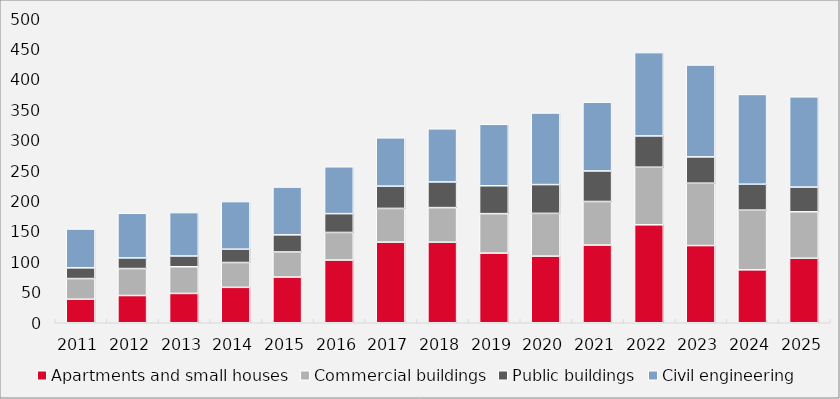
| Category | Apartments and small houses | Commercial buildings | Public buildings | Civil engineering |
|---|---|---|---|---|
| 2011.0 | 38.745 | 33.919 | 17.687 | 63.85 |
| 2012.0 | 44.777 | 44.354 | 17.47 | 73.444 |
| 2013.0 | 48.213 | 43.908 | 17.683 | 71.376 |
| 2014.0 | 58.248 | 40.844 | 21.916 | 78.301 |
| 2015.0 | 75.126 | 41.314 | 28.17 | 78.589 |
| 2016.0 | 103.136 | 45.359 | 30.965 | 77.108 |
| 2017.0 | 132.657 | 55.407 | 36.654 | 79.478 |
| 2018.0 | 132.554 | 56.824 | 42.217 | 87.371 |
| 2019.0 | 114.522 | 64.913 | 45.879 | 101.087 |
| 2020.0 | 109.582 | 70.336 | 47.345 | 117.77 |
| 2021.0 | 127.806 | 71.631 | 50.2 | 113.156 |
| 2022.0 | 161.117 | 94.706 | 51.419 | 137.106 |
| 2023.0 | 126.957 | 102.594 | 43.273 | 151.153 |
| 2024.0 | 87.05 | 98.169 | 42.66 | 147.647 |
| 2025.0 | 106.062 | 76.409 | 40.654 | 148.507 |